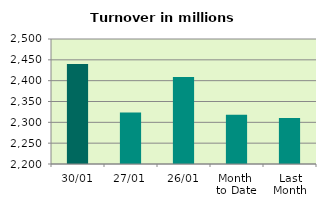
| Category | Series 0 |
|---|---|
| 30/01 | 2440.073 |
| 27/01 | 2323.879 |
| 26/01 | 2409.055 |
| Month 
to Date | 2318.056 |
| Last
Month | 2310.602 |